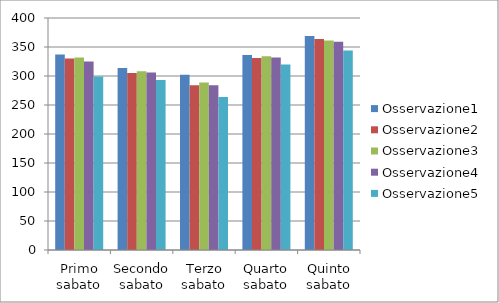
| Category | Osservazione1 | Osservazione2 | Osservazione3 | Osservazione4 | Osservazione5 |
|---|---|---|---|---|---|
| Primo sabato | 337 | 330 | 332 | 325 | 299 |
| Secondo sabato | 314 | 305 | 308 | 306 | 293 |
| Terzo sabato | 302 | 284 | 289 | 284 | 264 |
| Quarto sabato | 336 | 331 | 334 | 332 | 320 |
| Quinto sabato | 369 | 364 | 361 | 359 | 344 |